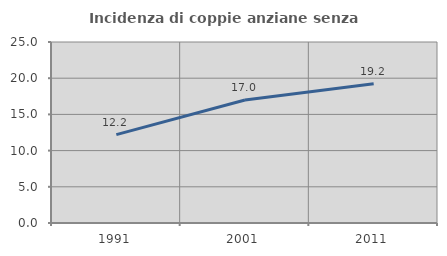
| Category | Incidenza di coppie anziane senza figli  |
|---|---|
| 1991.0 | 12.213 |
| 2001.0 | 16.998 |
| 2011.0 | 19.249 |